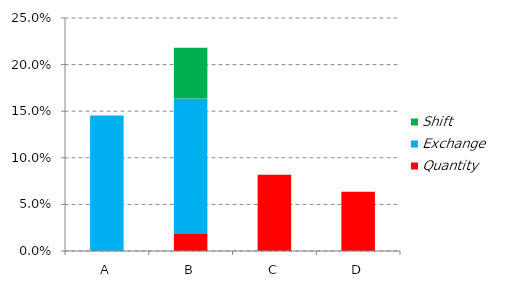
| Category | Quantity | Exchange | Shift |
|---|---|---|---|
| A | 0 | 0.145 | 0 |
| B | 0.018 | 0.145 | 0.055 |
| C | 0.082 | 0 | 0 |
| D | 0.064 | 0 | 0 |